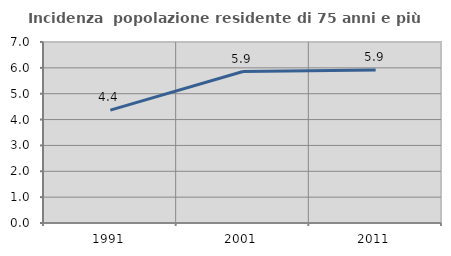
| Category | Incidenza  popolazione residente di 75 anni e più |
|---|---|
| 1991.0 | 4.364 |
| 2001.0 | 5.858 |
| 2011.0 | 5.915 |